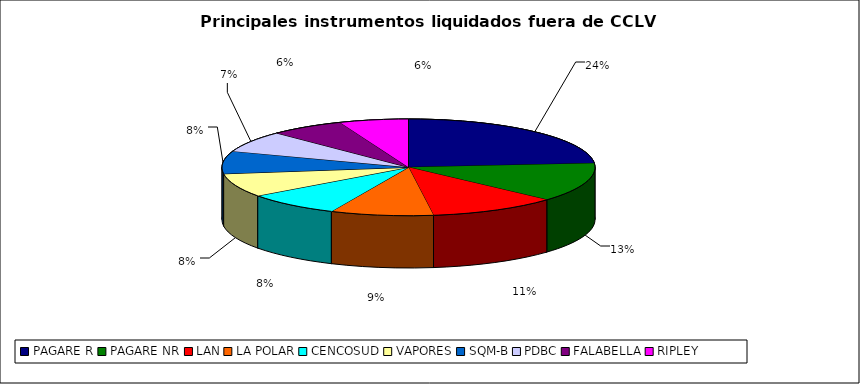
| Category | Series 0 |
|---|---|
| PAGARE R | 2434 |
| PAGARE NR | 1340 |
| LAN | 1146 |
| LA POLAR | 917 |
| CENCOSUD | 843 |
| VAPORES | 811 |
| SQM-B | 779 |
| PDBC | 727 |
| FALABELLA | 668 |
| RIPLEY | 615 |